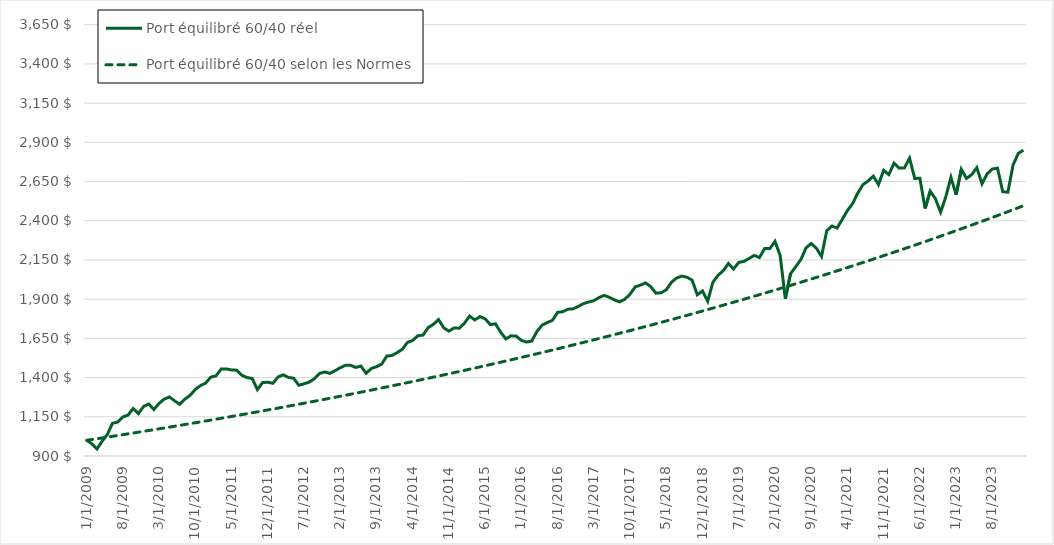
| Category | Port équilibré 60/40 réel | Port équilibré 60/40 selon les Normes |
|---|---|---|
| 1/1/09 | 1000 | 1000 |
| 2/1/09 | 978.422 | 1005.065 |
| 3/1/09 | 944.396 | 1010.155 |
| 4/1/09 | 994.067 | 1015.272 |
| 5/1/09 | 1036.85 | 1020.414 |
| 6/1/09 | 1108.603 | 1025.582 |
| 7/1/09 | 1116.56 | 1030.776 |
| 8/1/09 | 1149.031 | 1035.997 |
| 9/1/09 | 1160.659 | 1041.244 |
| 10/1/09 | 1202.584 | 1046.518 |
| 11/1/09 | 1170.788 | 1051.818 |
| 12/1/09 | 1215.014 | 1057.146 |
| 1/1/10 | 1231.971 | 1062.5 |
| 2/1/10 | 1196.403 | 1067.881 |
| 3/1/10 | 1235.203 | 1073.29 |
| 4/1/10 | 1262.739 | 1078.726 |
| 5/1/10 | 1276.399 | 1084.19 |
| 6/1/10 | 1251.861 | 1089.681 |
| 7/1/10 | 1229.159 | 1095.2 |
| 8/1/10 | 1262.458 | 1100.747 |
| 9/1/10 | 1286.913 | 1106.322 |
| 10/1/10 | 1324.046 | 1111.925 |
| 11/1/10 | 1348.661 | 1117.557 |
| 12/1/10 | 1364.893 | 1123.217 |
| 1/1/11 | 1403.073 | 1128.906 |
| 2/1/11 | 1410.486 | 1134.624 |
| 3/1/11 | 1454.216 | 1140.371 |
| 4/1/11 | 1455.194 | 1146.146 |
| 5/1/11 | 1448.744 | 1151.951 |
| 6/1/11 | 1447.094 | 1157.786 |
| 7/1/11 | 1414.514 | 1163.65 |
| 8/1/11 | 1400.064 | 1169.544 |
| 9/1/11 | 1394.339 | 1175.467 |
| 10/1/11 | 1323.311 | 1181.421 |
| 11/1/11 | 1368.312 | 1187.404 |
| 12/1/11 | 1370.465 | 1193.418 |
| 1/1/12 | 1363.603 | 1199.463 |
| 2/1/12 | 1404.152 | 1205.538 |
| 3/1/12 | 1417.368 | 1211.644 |
| 4/1/12 | 1400.745 | 1217.781 |
| 5/1/12 | 1395.959 | 1223.948 |
| 6/1/12 | 1350.929 | 1230.148 |
| 7/1/12 | 1360.309 | 1236.378 |
| 8/1/12 | 1370.499 | 1242.64 |
| 9/1/12 | 1392.842 | 1248.934 |
| 10/1/12 | 1426.652 | 1255.26 |
| 11/1/12 | 1435.48 | 1261.617 |
| 12/1/12 | 1426.763 | 1268.007 |
| 1/1/13 | 1443.908 | 1274.429 |
| 2/1/13 | 1462.513 | 1280.884 |
| 3/1/13 | 1478.156 | 1287.372 |
| 4/1/13 | 1478.568 | 1293.892 |
| 5/1/13 | 1464.492 | 1300.445 |
| 6/1/13 | 1473.577 | 1307.032 |
| 7/1/13 | 1427.101 | 1313.652 |
| 8/1/13 | 1457.502 | 1320.305 |
| 9/1/13 | 1469.272 | 1326.992 |
| 10/1/13 | 1485.433 | 1333.713 |
| 11/1/13 | 1537.118 | 1340.468 |
| 12/1/13 | 1540.572 | 1347.258 |
| 1/1/14 | 1558.956 | 1354.081 |
| 2/1/14 | 1580.712 | 1360.939 |
| 3/1/14 | 1624.233 | 1367.832 |
| 4/1/14 | 1636.798 | 1374.76 |
| 5/1/14 | 1666.519 | 1381.723 |
| 6/1/14 | 1671.025 | 1388.721 |
| 7/1/14 | 1718.828 | 1395.755 |
| 8/1/14 | 1739.064 | 1402.824 |
| 9/1/14 | 1769.933 | 1409.929 |
| 10/1/14 | 1717.458 | 1417.07 |
| 11/1/14 | 1696.052 | 1424.248 |
| 12/1/14 | 1716.673 | 1431.461 |
| 1/1/15 | 1714.572 | 1438.711 |
| 2/1/15 | 1746.398 | 1445.998 |
| 3/1/15 | 1792.225 | 1453.322 |
| 4/1/15 | 1767.505 | 1460.683 |
| 5/1/15 | 1788.717 | 1468.081 |
| 6/1/15 | 1774.944 | 1475.516 |
| 7/1/15 | 1738.165 | 1482.99 |
| 8/1/15 | 1742.537 | 1490.501 |
| 9/1/15 | 1689.498 | 1498.05 |
| 10/1/15 | 1646.65 | 1505.637 |
| 11/1/15 | 1666.387 | 1513.263 |
| 12/1/15 | 1664.412 | 1520.927 |
| 1/1/16 | 1637.024 | 1528.631 |
| 2/1/16 | 1626.756 | 1536.373 |
| 3/1/16 | 1632.919 | 1544.154 |
| 4/1/16 | 1693.439 | 1551.975 |
| 5/1/16 | 1734.035 | 1559.836 |
| 6/1/16 | 1750.805 | 1567.736 |
| 7/1/16 | 1765.12 | 1575.676 |
| 8/1/16 | 1815.937 | 1583.657 |
| 9/1/16 | 1819.735 | 1591.678 |
| 10/1/16 | 1836.118 | 1599.74 |
| 11/1/16 | 1838.326 | 1607.842 |
| 12/1/16 | 1853.37 | 1615.985 |
| 1/1/17 | 1871.633 | 1624.17 |
| 2/1/17 | 1881.903 | 1632.396 |
| 3/1/17 | 1890.189 | 1640.664 |
| 4/1/17 | 1910.029 | 1648.974 |
| 5/1/17 | 1924.253 | 1657.326 |
| 6/1/17 | 1911.718 | 1665.72 |
| 7/1/17 | 1894.818 | 1674.156 |
| 8/1/17 | 1882.76 | 1682.636 |
| 9/1/17 | 1899.634 | 1691.158 |
| 10/1/17 | 1931.932 | 1699.723 |
| 11/1/17 | 1978.377 | 1708.332 |
| 12/1/17 | 1989.578 | 1716.984 |
| 1/1/18 | 2003.802 | 1725.681 |
| 2/1/18 | 1979.381 | 1734.421 |
| 3/1/18 | 1938.302 | 1743.206 |
| 4/1/18 | 1940.622 | 1752.035 |
| 5/1/18 | 1960.068 | 1760.908 |
| 6/1/18 | 2007.529 | 1769.827 |
| 7/1/18 | 2034.875 | 1778.791 |
| 8/1/18 | 2047.027 | 1787.8 |
| 9/1/18 | 2039.548 | 1796.855 |
| 10/1/18 | 2020.944 | 1805.956 |
| 11/1/18 | 1927.599 | 1815.103 |
| 12/1/18 | 1952.181 | 1824.296 |
| 1/1/19 | 1886.792 | 1833.536 |
| 2/1/19 | 2007.11 | 1842.822 |
| 3/1/19 | 2052.219 | 1852.156 |
| 4/1/19 | 2081.196 | 1861.537 |
| 5/1/19 | 2127.458 | 1870.965 |
| 6/1/19 | 2091.966 | 1880.441 |
| 7/1/19 | 2134.55 | 1889.965 |
| 8/1/19 | 2140.752 | 1899.538 |
| 9/1/19 | 2159.297 | 1909.159 |
| 10/1/19 | 2179.224 | 1918.828 |
| 11/1/19 | 2164.943 | 1928.547 |
| 12/1/19 | 2222.772 | 1938.315 |
| 1/1/20 | 2222.169 | 1948.132 |
| 2/1/20 | 2268.409 | 1957.999 |
| 3/1/20 | 2178.265 | 1967.916 |
| 4/1/20 | 1902.185 | 1977.883 |
| 5/1/20 | 2061.733 | 1987.9 |
| 6/1/20 | 2105.926 | 1997.969 |
| 7/1/20 | 2152.547 | 2008.088 |
| 8/1/20 | 2226.829 | 2018.259 |
| 9/1/20 | 2254.776 | 2028.481 |
| 10/1/20 | 2224.743 | 2038.755 |
| 11/1/20 | 2171.827 | 2049.081 |
| 12/1/20 | 2335.62 | 2059.459 |
| 1/1/21 | 2366.42 | 2069.89 |
| 2/1/21 | 2353.305 | 2080.374 |
| 3/1/21 | 2408.447 | 2090.91 |
| 4/1/21 | 2465.538 | 2101.501 |
| 5/1/21 | 2508.992 | 2112.144 |
| 6/1/21 | 2576.713 | 2122.842 |
| 7/1/21 | 2630.489 | 2133.594 |
| 8/1/21 | 2653.149 | 2144.4 |
| 9/1/21 | 2684.5 | 2155.261 |
| 10/1/21 | 2630.425 | 2166.177 |
| 11/1/21 | 2721.633 | 2177.148 |
| 12/1/21 | 2694.035 | 2188.175 |
| 1/1/22 | 2767.133 | 2199.258 |
| 2/1/22 | 2735.399 | 2210.397 |
| 3/1/22 | 2736.525 | 2221.592 |
| 4/1/22 | 2799.349 | 2232.844 |
| 5/1/22 | 2669.828 | 2244.153 |
| 6/1/22 | 2670.585 | 2255.52 |
| 7/1/22 | 2477.957 | 2266.943 |
| 8/1/22 | 2588.837 | 2278.425 |
| 9/1/22 | 2540.19 | 2289.965 |
| 10/1/22 | 2454.573 | 2301.563 |
| 11/1/22 | 2551.837 | 2313.22 |
| 12/1/22 | 2676.975 | 2324.936 |
| 1/1/23 | 2565.763 | 2336.712 |
| 2/1/23 | 2728.287 | 2348.547 |
| 3/1/23 | 2669.836 | 2360.442 |
| 4/1/23 | 2693.665 | 2372.397 |
| 5/1/23 | 2738.091 | 2384.413 |
| 6/1/23 | 2635.615 | 2396.49 |
| 7/1/23 | 2698.857 | 2408.627 |
| 8/1/23 | 2729.88 | 2420.827 |
| 9/1/23 | 2735.428 | 2433.088 |
| 10/1/23 | 2585.46 | 2445.411 |
| 11/1/23 | 2581.723 | 2457.797 |
| 12/1/23 | 2755.564 | 2470.245 |
| 1/1/24 | 2828.736 | 2482.756 |
| 2/1/24 | 2850.382 | 2495.331 |